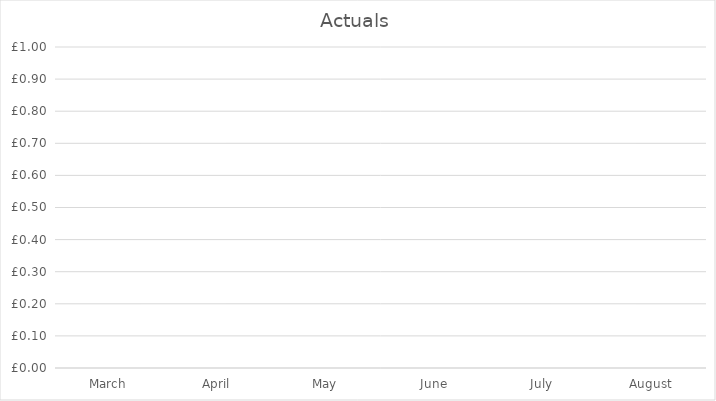
| Category | Series 0 |
|---|---|
| March | 0 |
| April | 0 |
| May | 0 |
| June | 0 |
| July | 0 |
| August | 0 |